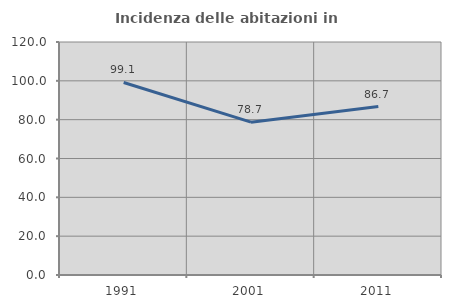
| Category | Incidenza delle abitazioni in proprietà  |
|---|---|
| 1991.0 | 99.145 |
| 2001.0 | 78.704 |
| 2011.0 | 86.747 |